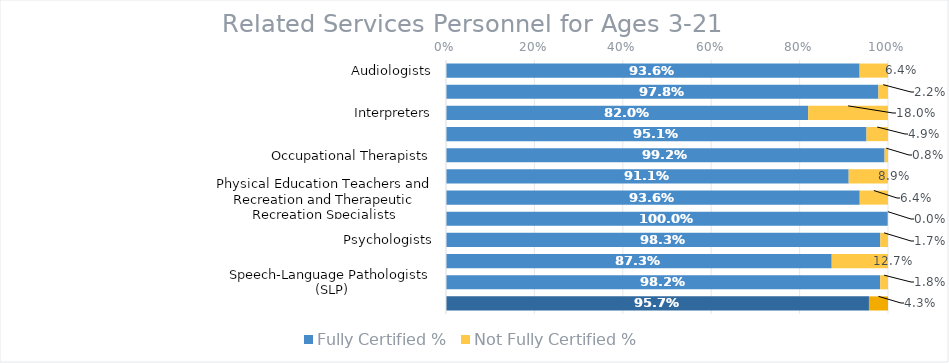
| Category | Fully Certified % | Not Fully Certified % |
|---|---|---|
| Audiologists | 0.936 | 0.064 |
| Counselors and Rehabilitation Counselors | 0.978 | 0.022 |
| Interpreters | 0.82 | 0.18 |
| Medical / Nursing Service Staff | 0.951 | 0.049 |
| Occupational Therapists | 0.992 | 0.008 |
| Orientation and Mobility Specialists | 0.911 | 0.089 |
| Physical Education Teachers and Recreation and Therapeutic Recreation Specialists | 0.936 | 0.064 |
| Physical Therapists | 1 | 0 |
| Psychologists | 0.983 | 0.017 |
| Social Workers | 0.873 | 0.127 |
| Speech-Language Pathologists (SLP) | 0.982 | 0.018 |
| Total Certified Status | 0.957 | 0.043 |